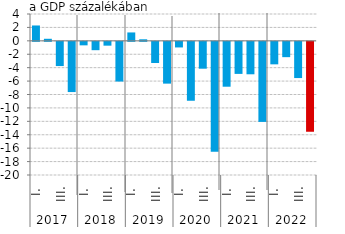
| Category | Series 0 |
|---|---|
| 0 | 2.289 |
| 1 | 0.306 |
| 2 | -3.611 |
| 3 | -7.487 |
| 4 | -0.523 |
| 5 | -1.246 |
| 6 | -0.57 |
| 7 | -5.92 |
| 8 | 1.251 |
| 9 | 0.229 |
| 10 | -3.153 |
| 11 | -6.231 |
| 12 | -0.836 |
| 13 | -8.784 |
| 14 | -4.002 |
| 15 | -16.387 |
| 16 | -6.69 |
| 17 | -4.78 |
| 18 | -4.838 |
| 19 | -11.936 |
| 20 | -3.355 |
| 21 | -2.285 |
| 22 | -5.4 |
| 23 | -13.4 |